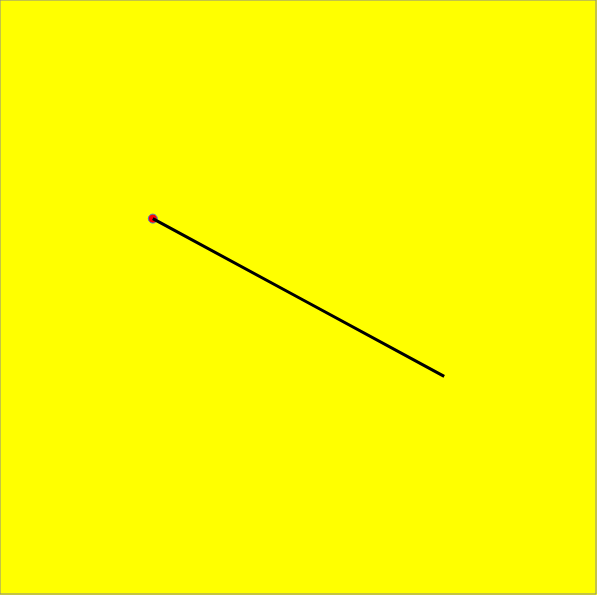
| Category | Series 0 |
|---|---|
| -5.13923773151656 | 2.793 |
| 5.139237731516561 | -2.793 |